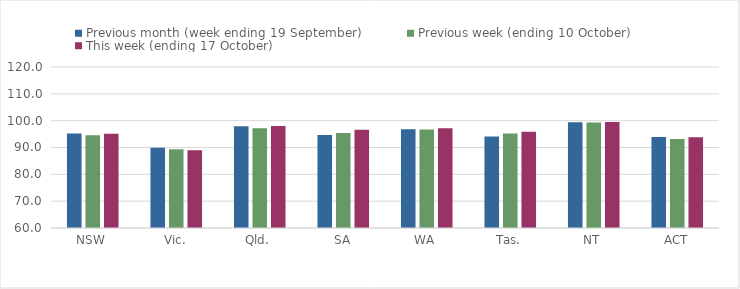
| Category | Previous month (week ending 19 September) | Previous week (ending 10 October) | This week (ending 17 October) |
|---|---|---|---|
| NSW | 95.25 | 94.56 | 95.12 |
| Vic. | 89.87 | 89.31 | 88.95 |
| Qld. | 97.96 | 97.18 | 97.98 |
| SA | 94.62 | 95.39 | 96.59 |
| WA | 96.77 | 96.74 | 97.14 |
| Tas. | 94.09 | 95.21 | 95.86 |
| NT | 99.43 | 99.34 | 99.53 |
| ACT | 93.95 | 93.21 | 93.78 |